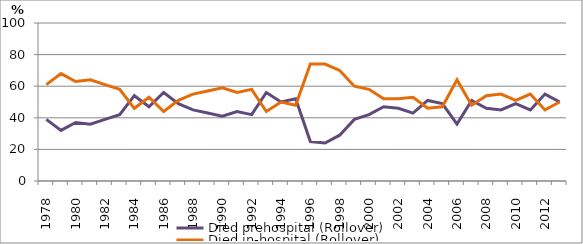
| Category | Died prehospital (Rollover) | Died in-hospital (Rollover) |
|---|---|---|
| 1978.0 | 39 | 61 |
| 1979.0 | 32 | 68 |
| 1980.0 | 37 | 63 |
| 1981.0 | 36 | 64 |
| 1982.0 | 39 | 61 |
| 1983.0 | 42 | 58 |
| 1984.0 | 54 | 46 |
| 1985.0 | 47 | 53 |
| 1986.0 | 56 | 44 |
| 1987.0 | 49 | 51 |
| 1988.0 | 45 | 55 |
| 1989.0 | 43 | 57 |
| 1990.0 | 41 | 59 |
| 1991.0 | 44 | 56 |
| 1992.0 | 42 | 58 |
| 1993.0 | 56 | 44 |
| 1994.0 | 50 | 50 |
| 1995.0 | 52 | 48 |
| 1996.0 | 25 | 74 |
| 1997.0 | 24 | 74 |
| 1998.0 | 29 | 70 |
| 1999.0 | 39 | 60 |
| 2000.0 | 42 | 58 |
| 2001.0 | 47 | 52 |
| 2002.0 | 46 | 52 |
| 2003.0 | 43 | 53 |
| 2004.0 | 51 | 46 |
| 2005.0 | 49 | 47 |
| 2006.0 | 36 | 64 |
| 2007.0 | 51 | 48 |
| 2008.0 | 46 | 54 |
| 2009.0 | 45 | 55 |
| 2010.0 | 49 | 51 |
| 2011.0 | 45 | 55 |
| 2012.0 | 55 | 45 |
| 2013.0 | 50 | 50 |